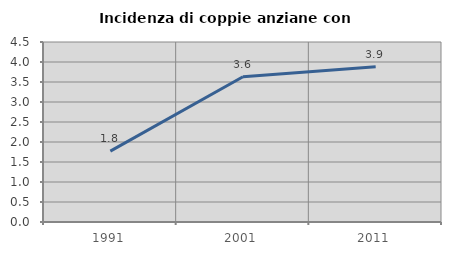
| Category | Incidenza di coppie anziane con figli |
|---|---|
| 1991.0 | 1.772 |
| 2001.0 | 3.63 |
| 2011.0 | 3.88 |